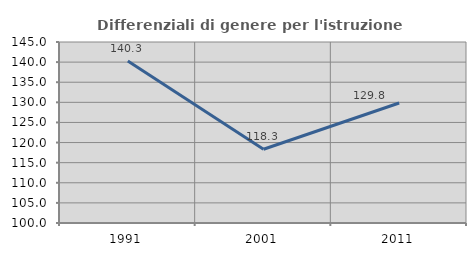
| Category | Differenziali di genere per l'istruzione superiore |
|---|---|
| 1991.0 | 140.284 |
| 2001.0 | 118.341 |
| 2011.0 | 129.844 |